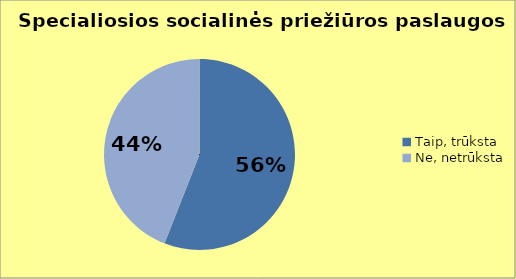
| Category | Series 0 |
|---|---|
| Taip, trūksta | 61 |
| Ne, netrūksta | 48 |